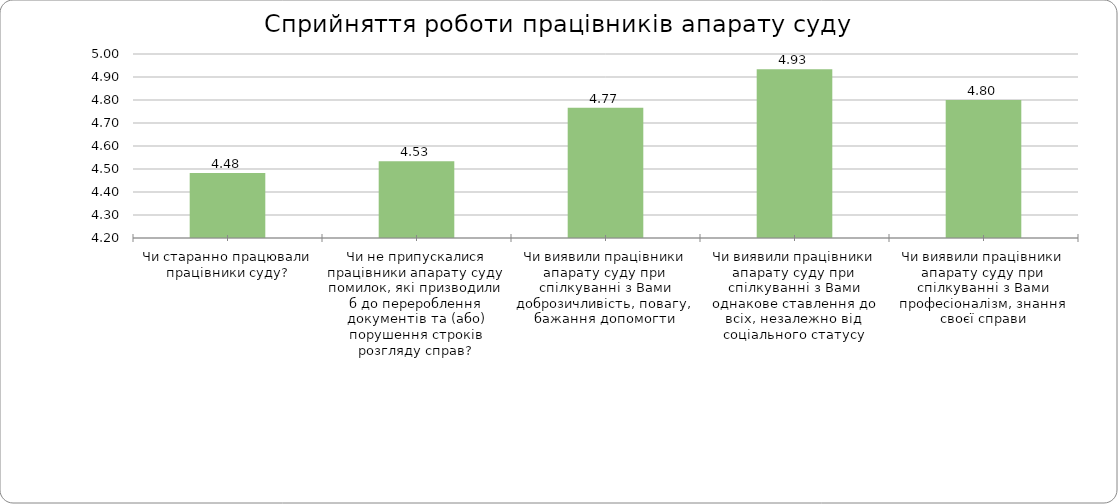
| Category | Series 0 |
|---|---|
| Чи старанно працювали працівники суду? | 4.483 |
| Чи не припускалися працівники апарату суду помилок, які призводили б до перероблення документів та (або) порушення строків розгляду справ? | 4.533 |
| Чи виявили працівники апарату суду при спілкуванні з Вами доброзичливість, повагу, бажання допомогти | 4.767 |
| Чи виявили працівники апарату суду при спілкуванні з Вами однакове ставлення до всіх, незалежно від соціального статусу | 4.933 |
| Чи виявили працівники апарату суду при спілкуванні з Вами професіоналізм, знання своєї справи | 4.8 |